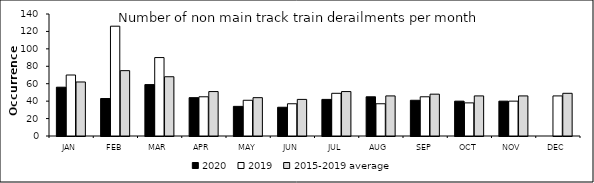
| Category | 2020 | 2019 | 2015-2019 average |
|---|---|---|---|
| JAN | 56 | 70 | 62 |
| FEB | 43 | 126 | 75 |
| MAR | 59 | 90 | 68 |
| APR | 44 | 45 | 51 |
| MAY | 34 | 41 | 44 |
| JUN | 33 | 37 | 42 |
| JUL | 42 | 49 | 51 |
| AUG | 45 | 37 | 46 |
| SEP | 41 | 45 | 48 |
| OCT | 40 | 38 | 46 |
| NOV | 40 | 40 | 46 |
| DEC | 0 | 46 | 49 |